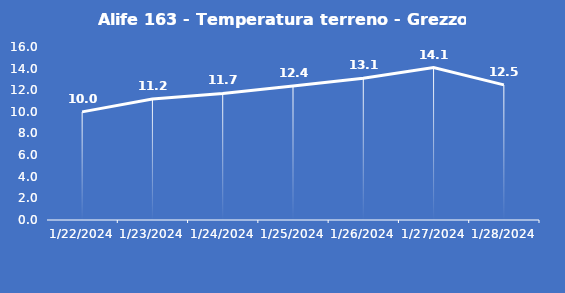
| Category | Alife 163 - Temperatura terreno - Grezzo (°C) |
|---|---|
| 1/22/24 | 10 |
| 1/23/24 | 11.2 |
| 1/24/24 | 11.7 |
| 1/25/24 | 12.4 |
| 1/26/24 | 13.1 |
| 1/27/24 | 14.1 |
| 1/28/24 | 12.5 |